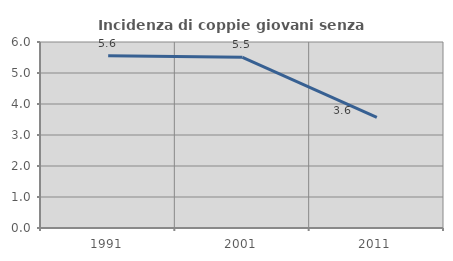
| Category | Incidenza di coppie giovani senza figli |
|---|---|
| 1991.0 | 5.553 |
| 2001.0 | 5.506 |
| 2011.0 | 3.571 |